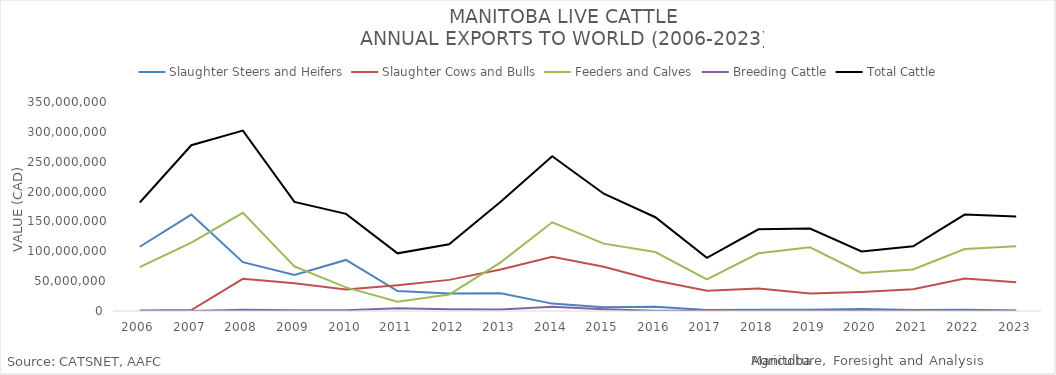
| Category | Slaughter Steers and Heifers | Slaughter Cows and Bulls | Feeders and Calves | Breeding Cattle | Total Cattle |
|---|---|---|---|---|---|
| 2006 | 107597923 | 725207 | 73339466 | 0 | 181662596 |
| 2007 | 161508887 | 1593027 | 114420860 | 46023 | 277568797 |
| 2008 | 81781537 | 53945224 | 164351094 | 2072364 | 302150219 |
| 2009 | 60302347 | 46466420 | 74743711 | 1263383 | 182775861 |
| 2010 | 85538277 | 36135913 | 39592738 | 1357369 | 162624297 |
| 2011 | 33357100 | 43185338 | 15369967 | 4644664 | 96557069 |
| 2012 | 29121198 | 52107606 | 27671417 | 2723584 | 111623805 |
| 2013 | 29673436 | 69508675 | 81377371 | 2361518 | 182921000 |
| 2014 | 12373165 | 90959541 | 148528093 | 7190631 | 259051430 |
| 2015 | 6443118 | 74009889 | 112828453 | 3127949 | 196409409 |
| 2016 | 6984426 | 51024566 | 98662583 | 369129 | 157040704 |
| 2017 | 1533527 | 34081637 | 53139099 | 348737 | 89103000 |
| 2018 | 2103694 | 37767216 | 96571847 | 318146 | 136760903 |
| 2019 | 1917411 | 29156634 | 106742455 | 211986 | 138028486 |
| 2020 | 3477533 | 31949114 | 63790917 | 570445 | 99788009 |
| 2021 | 1718970 | 36386077 | 69666875 | 470110 | 108242032 |
| 2022 | 2250707 | 54500235 | 103916947 | 853476 | 161521365 |
| 2023 | 1021888 | 48289688 | 108534040 | 593838 | 158439454 |